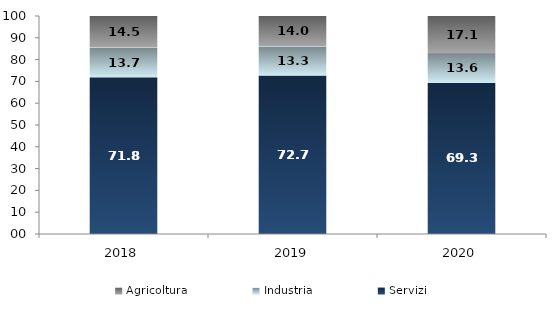
| Category | Servizi | Industria | Agricoltura |
|---|---|---|---|
| 2018.0 | 71.8 | 13.7 | 14.5 |
| 2019.0 | 72.7 | 13.3 | 14 |
| 2020.0 | 69.3 | 13.6 | 17.1 |